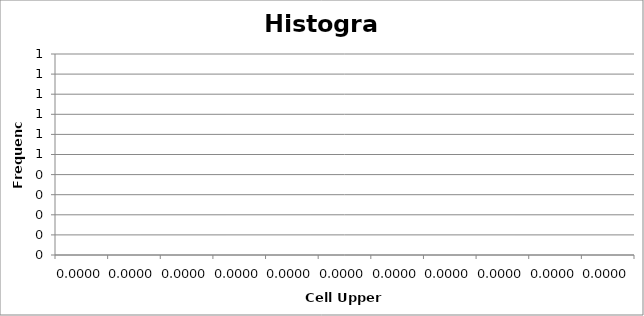
| Category | Series 0 |
|---|---|
| 0.0 | 0 |
| 0.0 | 0 |
| 0.0 | 0 |
| 0.0 | 0 |
| 0.0 | 0 |
| 0.0 | 0 |
| 0.0 | 0 |
| 0.0 | 0 |
| 0.0 | 0 |
| 0.0 | 0 |
| 0.0 | 0 |